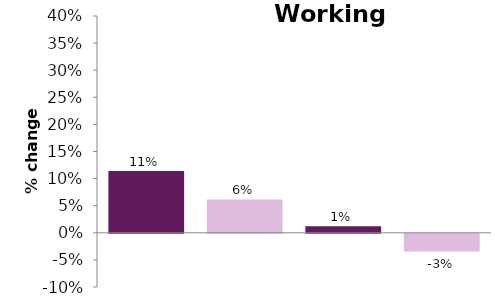
| Category | Working age |
|---|---|
| 0 | 0.114 |
| 1 | 0.062 |
| 2 | 0.012 |
| 3 | -0.033 |